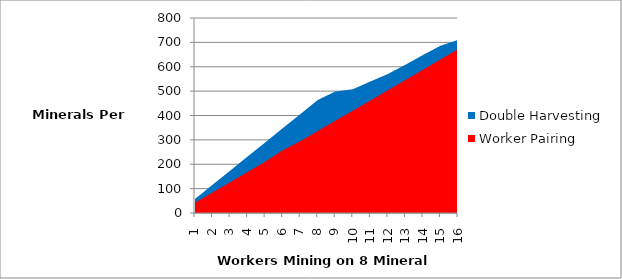
| Category | Double Harvesting | Worker Pairing |
|---|---|---|
| 1.0 | 57.9 | 42 |
| 2.0 | 115.8 | 84 |
| 3.0 | 173.7 | 126 |
| 4.0 | 231.6 | 168 |
| 5.0 | 289.5 | 210 |
| 6.0 | 347.4 | 257 |
| 7.0 | 405.3 | 294 |
| 8.0 | 463.3 | 336 |
| 9.0 | 498 | 378 |
| 10.0 | 508 | 420 |
| 11.0 | 540 | 462 |
| 12.0 | 570 | 504 |
| 13.0 | 608 | 546 |
| 14.0 | 648 | 588 |
| 15.0 | 686 | 630 |
| 16.0 | 710 | 672 |